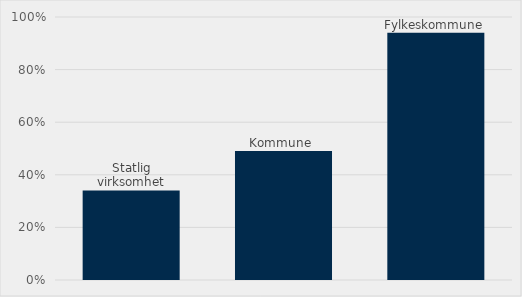
| Category | Estimert verdi som har miljø som kontraktsvilkår(%) |
|---|---|
| Statlig virksomhet | 0.341 |
| Kommune  | 0.491 |
| Fylkeskommune | 0.94 |